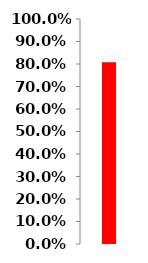
| Category | Series 0 |
|---|---|
| 0 | 0.807 |